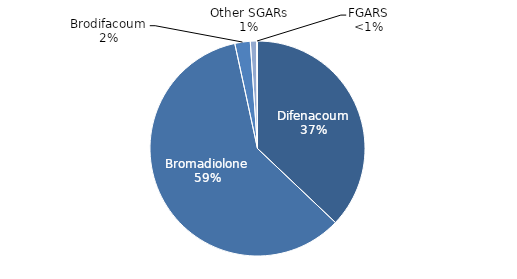
| Category | Series 0 |
|---|---|
| Difenacoum | 48158.607 |
| Bromadiolone | 77275.786 |
| Brodifacoum | 3009.075 |
| Other SGARs | 1215.816 |
| FGARS | 181.86 |